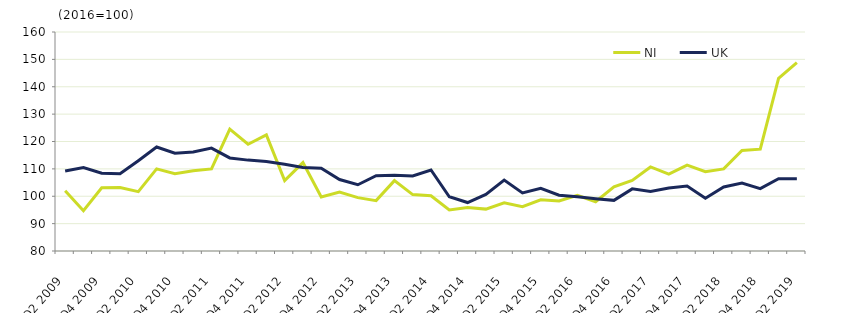
| Category | NI  | UK  |
|---|---|---|
| Q2 2009 | 102 | 109.2 |
|  | 94.7 | 110.5 |
| Q4 2009 | 103.1 | 108.4 |
|  | 103.2 | 108.2 |
| Q2 2010 | 101.7 | 113 |
|  | 110 | 118 |
| Q4 2010 | 108.2 | 115.7 |
|  | 109.3 | 116.2 |
| Q2 2011 | 110 | 117.6 |
|  | 124.5 | 114 |
| Q4 2011 | 119 | 113.2 |
|  | 122.4 | 112.7 |
| Q2 2012 | 105.7 | 111.7 |
|  | 112.3 | 110.5 |
| Q4 2012 | 99.7 | 110.2 |
|  | 101.5 | 106.1 |
| Q2 2013 | 99.5 | 104.2 |
|  | 98.4 | 107.5 |
| Q4 2013 | 105.7 | 107.7 |
|  | 100.6 | 107.4 |
| Q2 2014 | 100.2 | 109.6 |
|  | 95 | 99.8 |
| Q4 2014 | 95.9 | 97.7 |
|  | 95.3 | 100.7 |
| Q2 2015 | 97.6 | 105.9 |
|  | 96.2 | 101.2 |
| Q4 2015 | 98.7 | 102.9 |
|  | 98.3 | 100.4 |
| Q2 2016 | 100.3 | 99.8 |
|  | 98 | 99.1 |
| Q4 2016 | 103.4 | 98.5 |
|  | 105.8 | 102.7 |
| Q2 2017 | 110.7 | 101.7 |
|  | 108.1 | 103 |
| Q4 2017 | 111.4 | 103.7 |
|  | 109 | 99.3 |
| Q2 2018 | 110 | 103.4 |
|  | 116.7 | 104.8 |
| Q4 2018 | 117.2 | 102.8 |
|  | 143.1 | 106.4 |
| Q2 2019 | 148.8 | 106.4 |